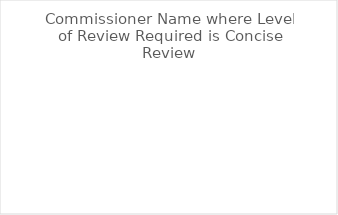
| Category | Series 0 |
|---|---|
| full name | 0 |
| other text | 0 |
| empty | 0 |